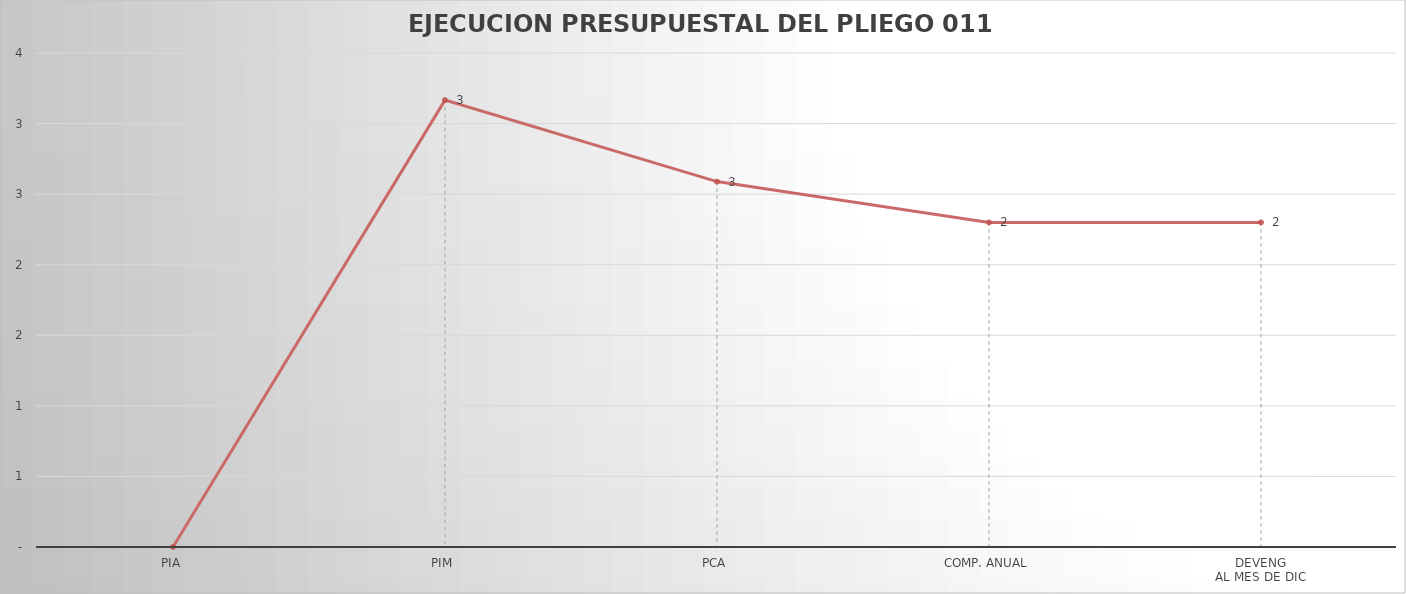
| Category | Series 0 |
|---|---|
| PIA | 0 |
| PIM | 3.166 |
| PCA | 2.589 |
| COMP. ANUAL | 2.3 |
| DEVENG
AL MES DE DIC | 2.3 |